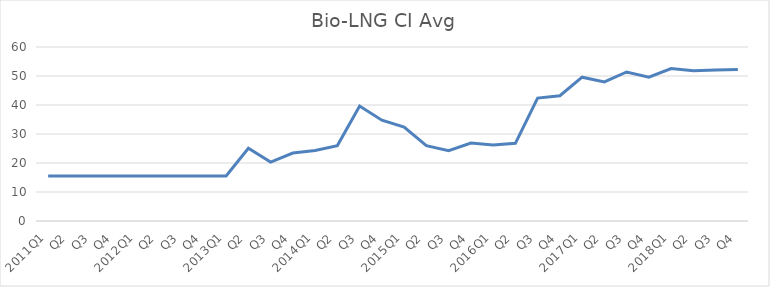
| Category | Series 0 |
|---|---|
| 2011Q1 | 15.56 |
| Q2 | 15.56 |
| Q3 | 15.56 |
| Q4 | 15.56 |
| 2012Q1 | 15.56 |
| Q2 | 15.56 |
| Q3 | 15.56 |
| Q4 | 15.56 |
| 2013Q1 | 15.56 |
| Q2 | 25.06 |
| Q3 | 20.32 |
| Q4 | 23.42 |
| 2014Q1 | 24.31 |
| Q2 | 26 |
| Q3 | 39.65 |
| Q4 | 34.76 |
| 2015Q1 | 32.38 |
| Q2 | 25.96 |
| Q3 | 24.25 |
| Q4 | 26.86 |
| 2016Q1 | 26.17 |
| Q2 | 26.77 |
| Q3 | 42.38 |
| Q4 | 43.19 |
| 2017Q1 | 49.59 |
| Q2 | 47.97 |
| Q3 | 51.38 |
| Q4 | 49.57 |
| 2018Q1 | 52.59 |
| Q2 | 51.78 |
| Q3 | 52.1 |
| Q4 | 52.25 |